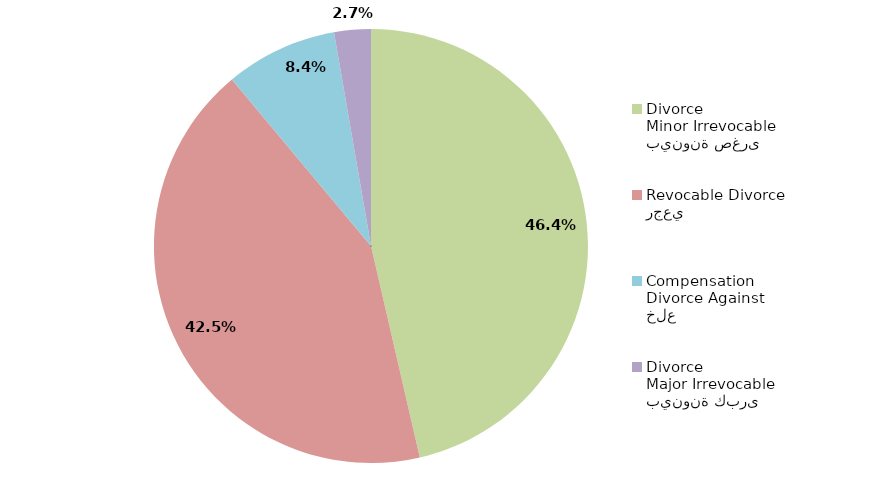
| Category | Series 1 |
|---|---|
| بينونة صغرى
Minor Irrevocable Divorce  | 46.388 |
| رجعي
Revocable Divorce  | 42.536 |
| خلع
Divorce Against Compensation | 8.347 |
| بينونة كبرى
Major Irrevocable Divorce  | 2.729 |